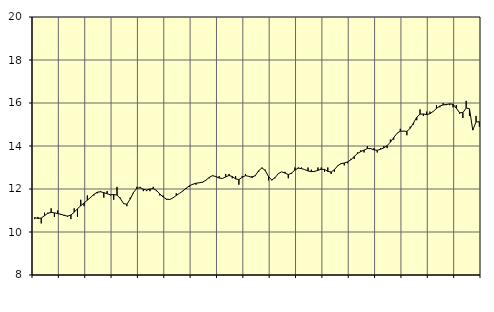
| Category | Piggar | Utbildning, SNI 85 |
|---|---|---|
| nan | 10.6 | 10.67 |
| 87.0 | 10.7 | 10.63 |
| 87.0 | 10.4 | 10.65 |
| 87.0 | 10.9 | 10.76 |
| nan | 10.9 | 10.87 |
| 88.0 | 11.1 | 10.91 |
| 88.0 | 10.7 | 10.89 |
| 88.0 | 11 | 10.86 |
| nan | 10.8 | 10.82 |
| 89.0 | 10.8 | 10.77 |
| 89.0 | 10.7 | 10.74 |
| 89.0 | 10.6 | 10.79 |
| nan | 11.1 | 10.92 |
| 90.0 | 10.7 | 11.08 |
| 90.0 | 11.5 | 11.22 |
| 90.0 | 11.2 | 11.35 |
| nan | 11.7 | 11.48 |
| 91.0 | 11.6 | 11.61 |
| 91.0 | 11.7 | 11.75 |
| 91.0 | 11.8 | 11.85 |
| nan | 11.9 | 11.87 |
| 92.0 | 11.6 | 11.83 |
| 92.0 | 11.9 | 11.78 |
| 92.0 | 11.7 | 11.73 |
| nan | 11.5 | 11.74 |
| 93.0 | 12.1 | 11.72 |
| 93.0 | 11.6 | 11.56 |
| 93.0 | 11.3 | 11.32 |
| nan | 11.2 | 11.29 |
| 94.0 | 11.6 | 11.53 |
| 94.0 | 11.8 | 11.84 |
| 94.0 | 12.1 | 12.03 |
| nan | 12.1 | 12.06 |
| 95.0 | 11.9 | 11.99 |
| 95.0 | 11.9 | 11.95 |
| 95.0 | 11.9 | 12 |
| nan | 12.1 | 12.02 |
| 96.0 | 11.9 | 11.93 |
| 96.0 | 11.7 | 11.77 |
| 96.0 | 11.7 | 11.63 |
| nan | 11.5 | 11.53 |
| 97.0 | 11.5 | 11.51 |
| 97.0 | 11.6 | 11.59 |
| 97.0 | 11.8 | 11.7 |
| nan | 11.8 | 11.8 |
| 98.0 | 11.9 | 11.91 |
| 98.0 | 12 | 12.04 |
| 98.0 | 12.1 | 12.15 |
| nan | 12.2 | 12.22 |
| 99.0 | 12.2 | 12.27 |
| 99.0 | 12.3 | 12.29 |
| 99.0 | 12.3 | 12.32 |
| nan | 12.4 | 12.41 |
| 0.0 | 12.5 | 12.54 |
| 0.0 | 12.6 | 12.62 |
| 0.0 | 12.6 | 12.58 |
| nan | 12.6 | 12.51 |
| 1.0 | 12.5 | 12.49 |
| 1.0 | 12.7 | 12.56 |
| 1.0 | 12.7 | 12.63 |
| nan | 12.5 | 12.58 |
| 2.0 | 12.6 | 12.47 |
| 2.0 | 12.2 | 12.44 |
| 2.0 | 12.6 | 12.54 |
| nan | 12.7 | 12.62 |
| 3.0 | 12.6 | 12.59 |
| 3.0 | 12.6 | 12.54 |
| 3.0 | 12.6 | 12.63 |
| nan | 12.8 | 12.85 |
| 4.0 | 13 | 12.98 |
| 4.0 | 12.9 | 12.86 |
| 4.0 | 12.4 | 12.58 |
| nan | 12.4 | 12.42 |
| 5.0 | 12.5 | 12.53 |
| 5.0 | 12.7 | 12.72 |
| 5.0 | 12.8 | 12.8 |
| nan | 12.8 | 12.74 |
| 6.0 | 12.5 | 12.67 |
| 6.0 | 12.7 | 12.74 |
| 6.0 | 13 | 12.88 |
| nan | 13 | 12.97 |
| 7.0 | 13 | 12.95 |
| 7.0 | 12.9 | 12.9 |
| 7.0 | 13 | 12.84 |
| nan | 12.9 | 12.81 |
| 8.0 | 12.8 | 12.82 |
| 8.0 | 13 | 12.87 |
| 8.0 | 13 | 12.92 |
| nan | 12.8 | 12.91 |
| 9.0 | 13 | 12.82 |
| 9.0 | 12.7 | 12.79 |
| 9.0 | 12.8 | 12.9 |
| nan | 13.1 | 13.08 |
| 10.0 | 13.2 | 13.18 |
| 10.0 | 13.1 | 13.21 |
| 10.0 | 13.2 | 13.26 |
| nan | 13.4 | 13.36 |
| 11.0 | 13.4 | 13.51 |
| 11.0 | 13.7 | 13.65 |
| 11.0 | 13.8 | 13.74 |
| nan | 13.7 | 13.81 |
| 12.0 | 14 | 13.88 |
| 12.0 | 13.9 | 13.88 |
| 12.0 | 13.9 | 13.82 |
| nan | 13.7 | 13.8 |
| 13.0 | 13.9 | 13.85 |
| 13.0 | 14 | 13.91 |
| 13.0 | 13.9 | 14.02 |
| nan | 14.3 | 14.18 |
| 14.0 | 14.3 | 14.39 |
| 14.0 | 14.6 | 14.59 |
| 14.0 | 14.8 | 14.69 |
| nan | 14.7 | 14.69 |
| 15.0 | 14.5 | 14.68 |
| 15.0 | 14.9 | 14.82 |
| 15.0 | 15 | 15.07 |
| nan | 15.2 | 15.34 |
| 16.0 | 15.7 | 15.48 |
| 16.0 | 15.4 | 15.49 |
| 16.0 | 15.6 | 15.46 |
| nan | 15.6 | 15.5 |
| 17.0 | 15.6 | 15.61 |
| 17.0 | 15.9 | 15.75 |
| 17.0 | 15.8 | 15.86 |
| nan | 16 | 15.91 |
| 18.0 | 15.9 | 15.93 |
| 18.0 | 15.9 | 15.96 |
| 18.0 | 15.8 | 15.94 |
| nan | 15.9 | 15.76 |
| 19.0 | 15.5 | 15.55 |
| 19.0 | 15.3 | 15.55 |
| 19.0 | 16.1 | 15.77 |
| nan | 15.4 | 15.73 |
| 20.0 | 14.8 | 14.74 |
| 20.0 | 15.4 | 15.12 |
| 20.0 | 14.9 | 15.13 |